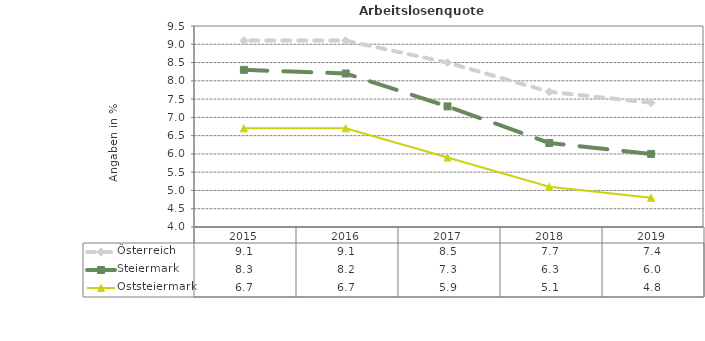
| Category | Österreich | Steiermark | Oststeiermark |
|---|---|---|---|
| 2019.0 | 7.4 | 6 | 4.8 |
| 2018.0 | 7.7 | 6.3 | 5.1 |
| 2017.0 | 8.5 | 7.3 | 5.9 |
| 2016.0 | 9.1 | 8.2 | 6.7 |
| 2015.0 | 9.1 | 8.3 | 6.7 |